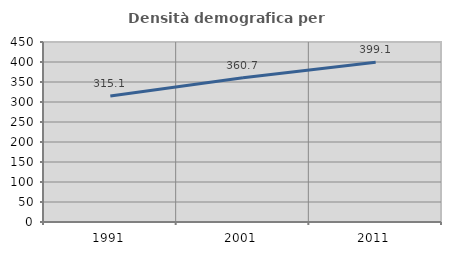
| Category | Densità demografica |
|---|---|
| 1991.0 | 315.104 |
| 2001.0 | 360.654 |
| 2011.0 | 399.141 |